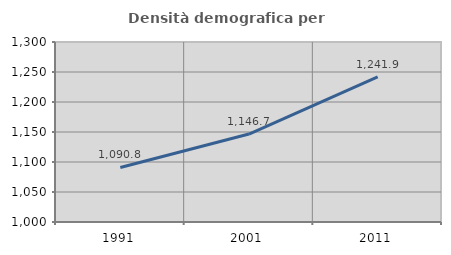
| Category | Densità demografica |
|---|---|
| 1991.0 | 1090.848 |
| 2001.0 | 1146.658 |
| 2011.0 | 1241.931 |